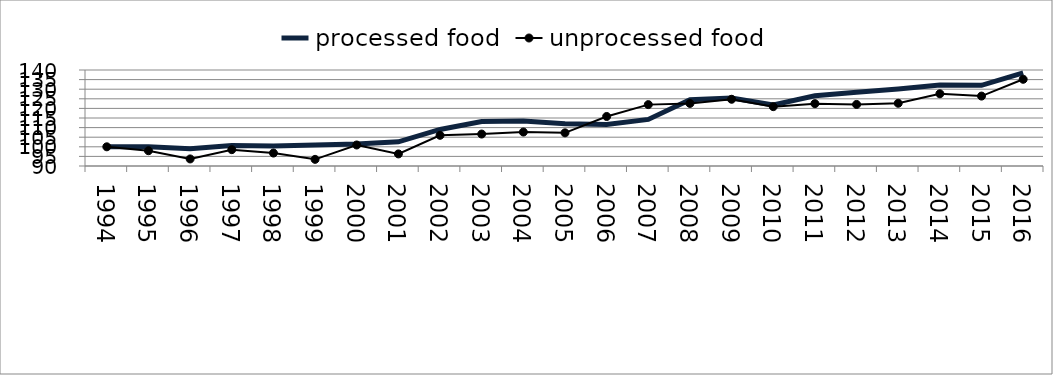
| Category | processed food | unprocessed food |
|---|---|---|
| 1994.0 | 100 | 100 |
| 1995.0 | 100.051 | 97.96 |
| 1996.0 | 99.046 | 93.676 |
| 1997.0 | 100.728 | 98.506 |
| 1998.0 | 100.378 | 96.741 |
| 1999.0 | 100.9 | 93.466 |
| 2000.0 | 101.476 | 100.943 |
| 2001.0 | 102.575 | 96.294 |
| 2002.0 | 109.052 | 105.989 |
| 2003.0 | 113.161 | 106.637 |
| 2004.0 | 113.419 | 107.689 |
| 2005.0 | 112.063 | 107.269 |
| 2006.0 | 111.592 | 115.79 |
| 2007.0 | 114.269 | 121.967 |
| 2008.0 | 124.503 | 122.603 |
| 2009.0 | 125.365 | 124.754 |
| 2010.0 | 121.794 | 120.908 |
| 2011.0 | 126.566 | 122.469 |
| 2012.0 | 128.388 | 122.056 |
| 2013.0 | 130.064 | 122.676 |
| 2014.0 | 132.15 | 127.613 |
| 2015.0 | 131.998 | 126.41 |
| 2016.0 | 138.509 | 135.164 |